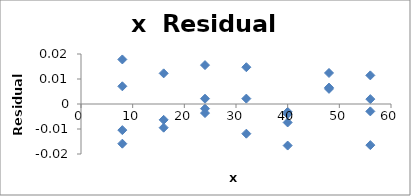
| Category | Series 0 |
|---|---|
| 8.0 | 0.018 |
| 8.0 | 0.007 |
| 8.0 | -0.01 |
| 8.0 | -0.016 |
| 16.0 | -0.006 |
| 16.0 | -0.009 |
| 16.0 | 0.012 |
| 24.0 | -0.004 |
| 24.0 | -0.002 |
| 24.0 | 0.002 |
| 24.0 | 0.016 |
| 32.0 | -0.012 |
| 32.0 | 0.002 |
| 32.0 | 0.015 |
| 40.0 | -0.007 |
| 40.0 | -0.003 |
| 40.0 | -0.017 |
| 40.0 | -0.004 |
| 48.0 | 0.006 |
| 48.0 | 0.007 |
| 48.0 | 0.012 |
| 56.0 | 0.002 |
| 56.0 | -0.003 |
| 56.0 | 0.011 |
| 56.0 | -0.016 |